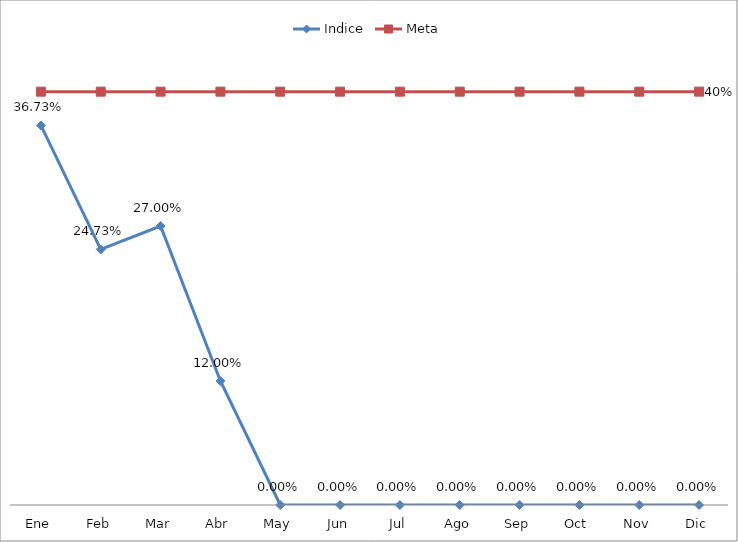
| Category | Indice | Meta |
|---|---|---|
| Ene | 0.367 | 0.4 |
| Feb | 0.247 | 0.4 |
| Mar | 0.27 | 0.4 |
| Abr | 0.12 | 0.4 |
| May | 0 | 0.4 |
| Jun | 0 | 0.4 |
| Jul | 0 | 0.4 |
| Ago | 0 | 0.4 |
| Sep | 0 | 0.4 |
| Oct | 0 | 0.4 |
| Nov | 0 | 0.4 |
| Dic | 0 | 0.4 |